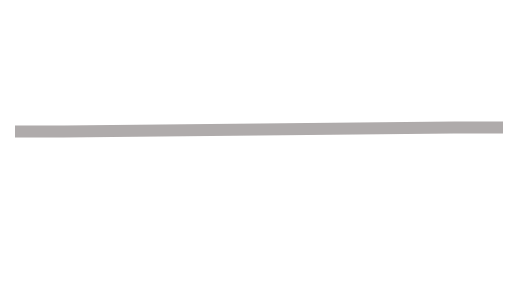
| Category | Series1 | Series2 | Series3 |
|---|---|---|---|
| 0.0 | 820 | 90 | 1020 |
| 10.0 | 820 | 90 | 1020 |
| 90.0 | 790 | 90 | 1050 |
| 100.0 | 790 | 90 | 1050 |